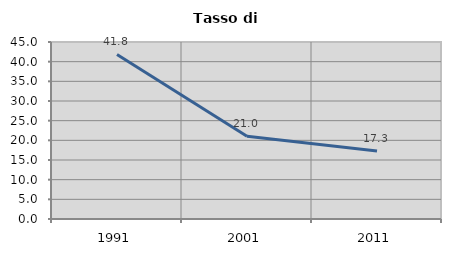
| Category | Tasso di disoccupazione   |
|---|---|
| 1991.0 | 41.823 |
| 2001.0 | 21.017 |
| 2011.0 | 17.314 |